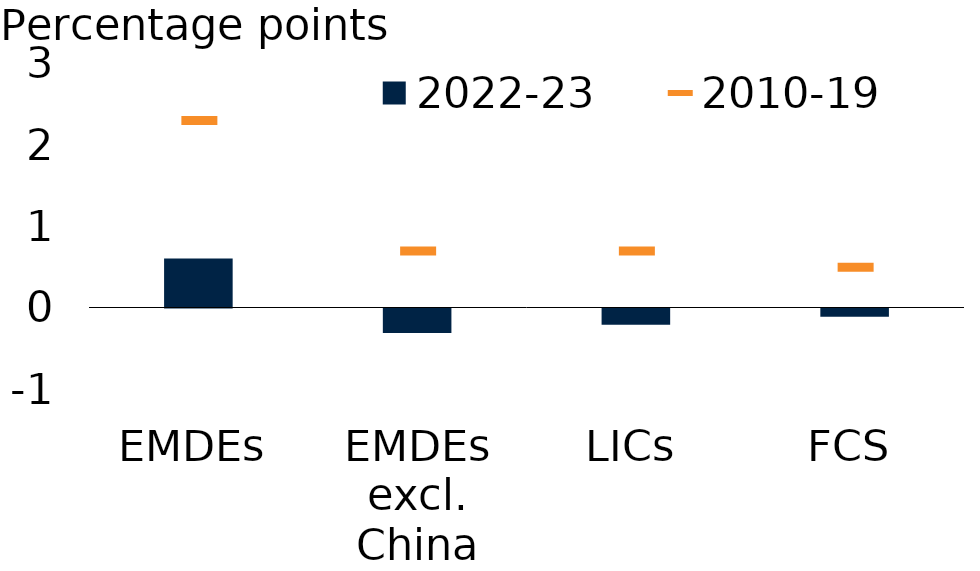
| Category | 2022-23 |
|---|---|
| EMDEs | 0.6 |
| EMDEs excl. China | -0.3 |
| LICs | -0.2 |
| FCS | -0.1 |